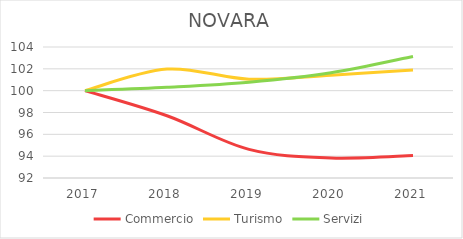
| Category | Commercio | Turismo | Servizi |
|---|---|---|---|
| 2017.0 | 100 | 100 | 100 |
| 2018.0 | 97.7 | 101.977 | 100.312 |
| 2019.0 | 94.621 | 101.05 | 100.775 |
| 2020.0 | 93.833 | 101.421 | 101.64 |
| 2021.0 | 94.06 | 101.884 | 103.129 |